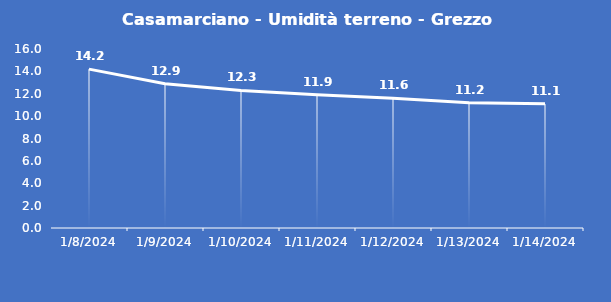
| Category | Casamarciano - Umidità terreno - Grezzo (%VWC) |
|---|---|
| 1/8/24 | 14.2 |
| 1/9/24 | 12.9 |
| 1/10/24 | 12.3 |
| 1/11/24 | 11.9 |
| 1/12/24 | 11.6 |
| 1/13/24 | 11.2 |
| 1/14/24 | 11.1 |